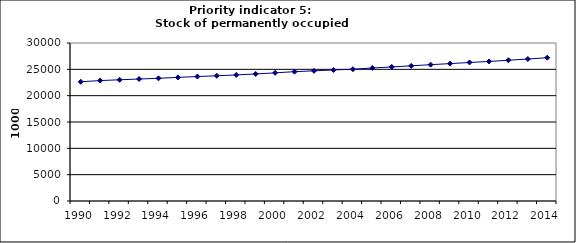
| Category | Stock of permanently occupied dwellings, 1000 |
|---|---|
| 1990 | 22643.922 |
| 1991 | 22862.734 |
| 1992 | 23016.502 |
| 1993 | 23159.711 |
| 1994 | 23298.46 |
| 1995 | 23470.105 |
| 1996 | 23627.609 |
| 1997 | 23777.987 |
| 1998 | 23937.522 |
| 1999 | 24122.857 |
| 2000 | 24333.192 |
| 2001 | 24557.508 |
| 2002 | 24716.354 |
| 2003 | 24871.129 |
| 2004 | 25026.305 |
| 2005 | 25255.534 |
| 2006 | 25453.426 |
| 2007 | 25658.652 |
| 2008 | 25885.165 |
| 2009 | 26086.034 |
| 2010 | 26301.302 |
| 2011 | 26490.938 |
| 2012 | 26728.611 |
| 2013 | 26955.808 |
| 2014 | 27210.165 |